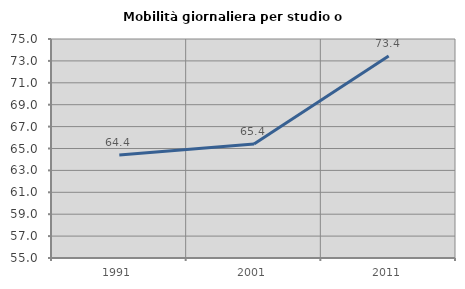
| Category | Mobilità giornaliera per studio o lavoro |
|---|---|
| 1991.0 | 64.408 |
| 2001.0 | 65.405 |
| 2011.0 | 73.445 |